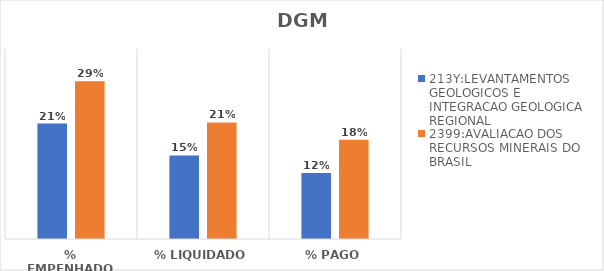
| Category | 213Y:LEVANTAMENTOS GEOLOGICOS E INTEGRACAO GEOLOGICA REGIONAL | 2399:AVALIACAO DOS RECURSOS MINERAIS DO BRASIL |
|---|---|---|
| % EMPENHADO | 0.213 | 0.291 |
| % LIQUIDADO | 0.154 | 0.215 |
| % PAGO | 0.122 | 0.183 |